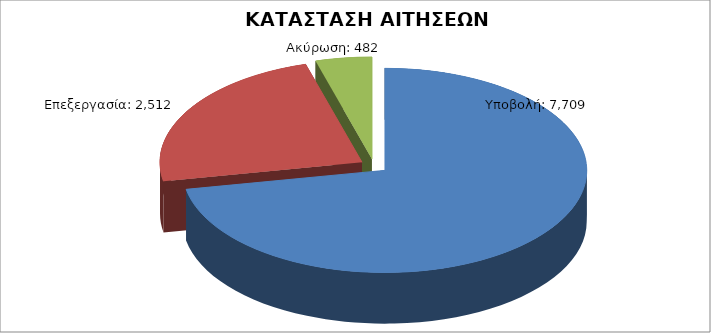
| Category | Series 0 |
|---|---|
| Υποβολή: | 7709 |
| Επεξεργασία: | 2512 |
| Ακύρωση: | 482 |